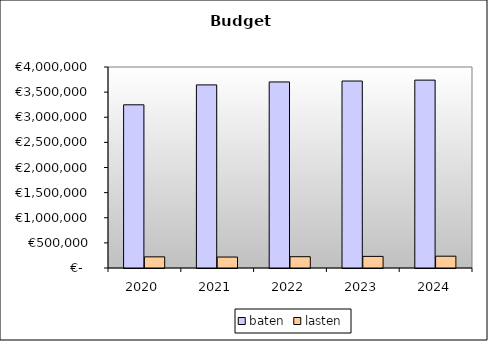
| Category | baten | lasten |
|---|---|---|
| 2020.0 | 3247614.156 | 221756.529 |
| 2021.0 | 3643740.192 | 218099.2 |
| 2022.0 | 3702702.349 | 224529.6 |
| 2023.0 | 3720848.339 | 231070.4 |
| 2024.0 | 3738994.329 | 234912 |